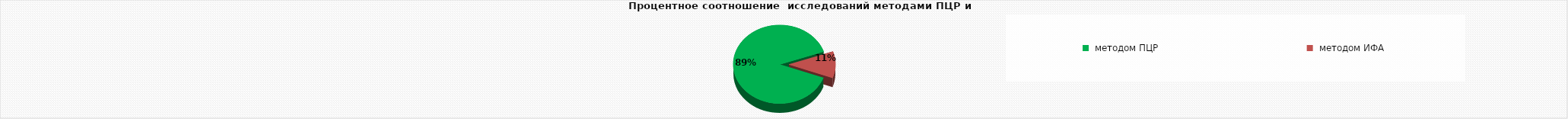
| Category | сыворотка | 1271 |
|---|---|---|
|  методом ПЦР | 1271 |  |
|  методом ИФА | 155 |  |